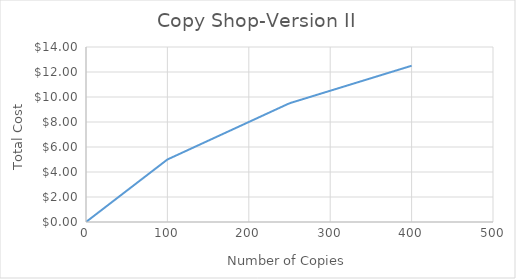
| Category | Series 0 |
|---|---|
| 0.0 | 0 |
| 4.0 | 0.2 |
| 8.0 | 0.4 |
| 12.0 | 0.6 |
| 16.0 | 0.8 |
| 20.0 | 1 |
| 24.0 | 1.2 |
| 28.0 | 1.4 |
| 32.0 | 1.6 |
| 36.0 | 1.8 |
| 40.0 | 2 |
| 44.0 | 2.2 |
| 48.0 | 2.4 |
| 52.0 | 2.6 |
| 56.0 | 2.8 |
| 60.0 | 3 |
| 64.0 | 3.2 |
| 68.0 | 3.4 |
| 72.0 | 3.6 |
| 76.0 | 3.8 |
| 80.0 | 4 |
| 84.0 | 4.2 |
| 88.0 | 4.4 |
| 92.0 | 4.6 |
| 96.0 | 4.8 |
| 100.0 | 5 |
| 104.0 | 5.12 |
| 108.0 | 5.24 |
| 112.0 | 5.36 |
| 116.0 | 5.48 |
| 120.0 | 5.6 |
| 124.0 | 5.72 |
| 128.0 | 5.84 |
| 132.0 | 5.96 |
| 136.0 | 6.08 |
| 140.0 | 6.2 |
| 144.0 | 6.32 |
| 148.0 | 6.44 |
| 152.0 | 6.56 |
| 156.0 | 6.68 |
| 160.0 | 6.8 |
| 164.0 | 6.92 |
| 168.0 | 7.04 |
| 172.0 | 7.16 |
| 176.0 | 7.28 |
| 180.0 | 7.4 |
| 184.0 | 7.52 |
| 188.0 | 7.64 |
| 192.0 | 7.76 |
| 196.0 | 7.88 |
| 200.0 | 8 |
| 204.0 | 8.12 |
| 208.0 | 8.24 |
| 212.0 | 8.36 |
| 216.0 | 8.48 |
| 220.0 | 8.6 |
| 224.0 | 8.72 |
| 228.0 | 8.84 |
| 232.0 | 8.96 |
| 236.0 | 9.08 |
| 240.0 | 9.2 |
| 244.0 | 9.32 |
| 248.0 | 9.44 |
| 252.0 | 9.54 |
| 256.0 | 9.62 |
| 260.0 | 9.7 |
| 264.0 | 9.78 |
| 268.0 | 9.86 |
| 272.0 | 9.94 |
| 276.0 | 10.02 |
| 280.0 | 10.1 |
| 284.0 | 10.18 |
| 288.0 | 10.26 |
| 292.0 | 10.34 |
| 296.0 | 10.42 |
| 300.0 | 10.5 |
| 304.0 | 10.58 |
| 308.0 | 10.66 |
| 312.0 | 10.74 |
| 316.0 | 10.82 |
| 320.0 | 10.9 |
| 324.0 | 10.98 |
| 328.0 | 11.06 |
| 332.0 | 11.14 |
| 336.0 | 11.22 |
| 340.0 | 11.3 |
| 344.0 | 11.38 |
| 348.0 | 11.46 |
| 352.0 | 11.54 |
| 356.0 | 11.62 |
| 360.0 | 11.7 |
| 364.0 | 11.78 |
| 368.0 | 11.86 |
| 372.0 | 11.94 |
| 376.0 | 12.02 |
| 380.0 | 12.1 |
| 384.0 | 12.18 |
| 388.0 | 12.26 |
| 392.0 | 12.34 |
| 396.0 | 12.42 |
| 400.0 | 12.5 |